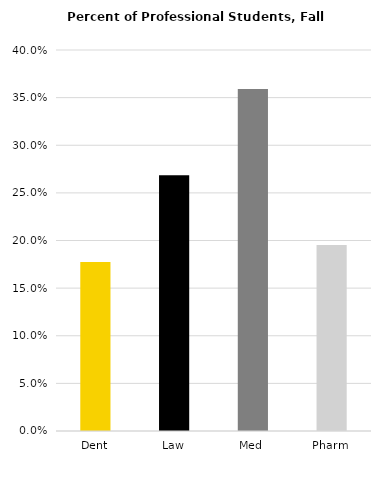
| Category | Series 0 |
|---|---|
| Dent | 0.177 |
| Law | 0.268 |
| Med | 0.359 |
| Pharm | 0.195 |